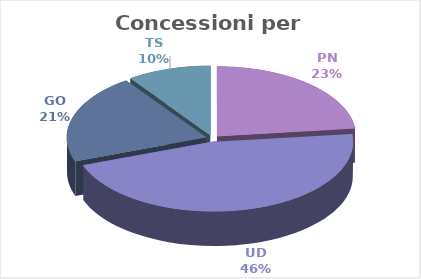
| Category | Series 0 |
|---|---|
| PN | 19387035 |
| UD | 38705730 |
| GO | 17405500 |
| TS | 8155000 |